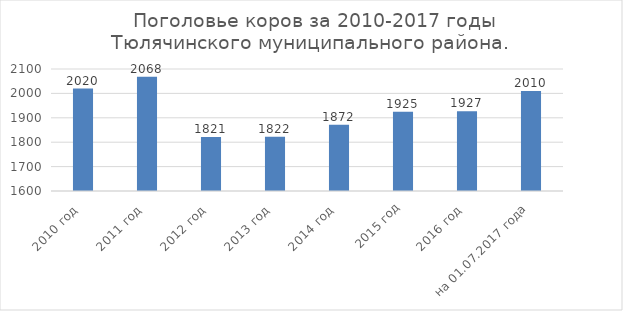
| Category | Series 0 |
|---|---|
| 2010 год  | 2020 |
| 2011 год  | 2068 |
| 2012 год  | 1821 |
| 2013 год  | 1822 |
| 2014 год  | 1872 |
| 2015 год | 1925 |
| 2016 год  | 1927 |
| на 01.07.2017 года  | 2010 |